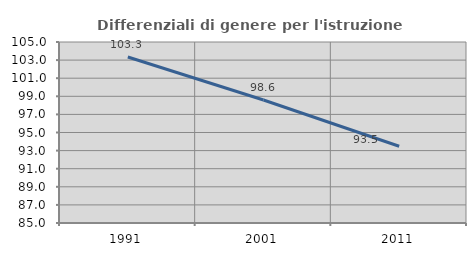
| Category | Differenziali di genere per l'istruzione superiore |
|---|---|
| 1991.0 | 103.34 |
| 2001.0 | 98.594 |
| 2011.0 | 93.484 |